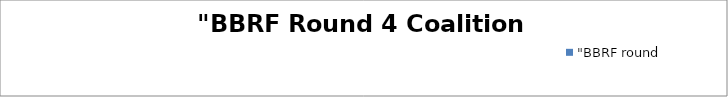
| Category | "BBRF round 4 curve" |
|---|---|
| Independent | 11355091 |
| Labor | 17975786 |
| Liberal | 57434035 |
| LNP | 47970652 |
| National | 70292932 |